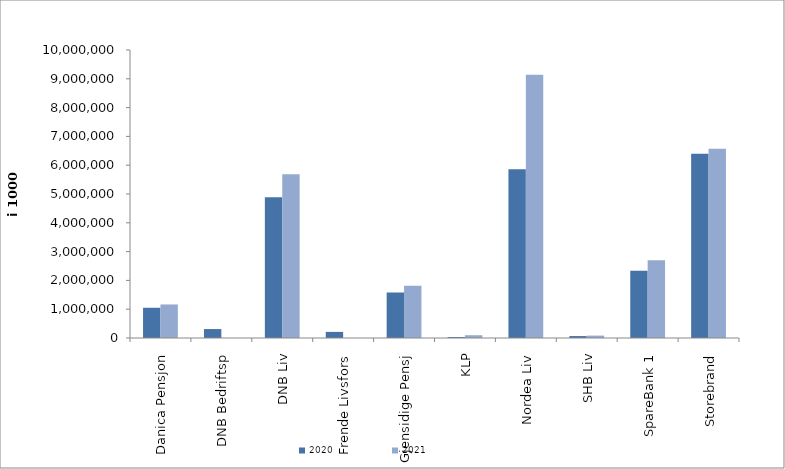
| Category | 2020 | 2021 |
|---|---|---|
| Danica Pensjon | 1049553.103 | 1164087.904 |
| DNB Bedriftsp | 310599 | 0 |
| DNB Liv | 4882926.419 | 5687337 |
| Frende Livsfors | 211959 | 0 |
| Gjensidige Pensj | 1579911 | 1813519 |
| KLP | 32970.711 | 96259.103 |
| Nordea Liv | 5863550.965 | 9140677.717 |
| SHB Liv | 67197.384 | 83074.45 |
| SpareBank 1 | 2338484.372 | 2700593.746 |
| Storebrand | 6396691.746 | 6574958.287 |